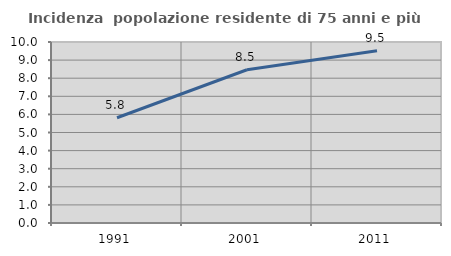
| Category | Incidenza  popolazione residente di 75 anni e più |
|---|---|
| 1991.0 | 5.814 |
| 2001.0 | 8.467 |
| 2011.0 | 9.515 |